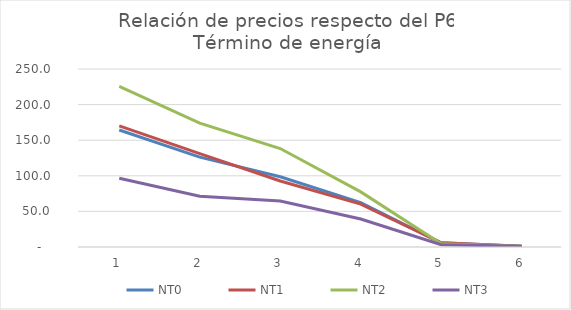
| Category | NT0 | NT1 | NT2 | NT3 |
|---|---|---|---|---|
| 0 | 164.3 | 170.176 | 225.667 | 96.649 |
| 1 | 126.183 | 131.101 | 174.003 | 71.27 |
| 2 | 98.644 | 92.716 | 138.323 | 64.538 |
| 3 | 62.421 | 60.177 | 77.368 | 39.391 |
| 4 | 5.929 | 5.808 | 4.661 | 3.137 |
| 5 | 1 | 1 | 1 | 1 |